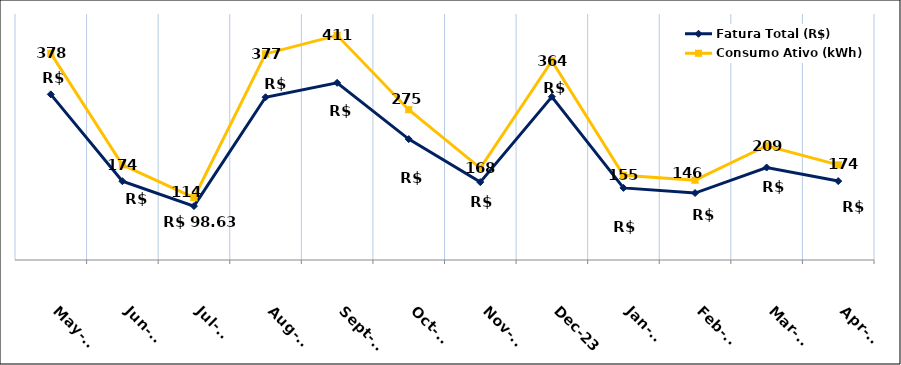
| Category | Fatura Total (R$) | Consumo Ativo (kWh) |
|---|---|---|
| 2023-05-01 | 302.95 | 378 |
| 2023-06-01 | 144.19 | 174 |
| 2023-07-01 | 98.63 | 114 |
| 2023-08-01 | 297.76 | 377 |
| 2023-09-01 | 324.06 | 411 |
| 2023-10-01 | 221.12 | 275 |
| 2023-11-01 | 142.44 | 168 |
| 2023-12-01 | 298.6 | 364 |
| 2024-01-01 | 131.93 | 155 |
| 2024-02-01 | 122.49 | 146 |
| 2024-03-01 | 169.19 | 209 |
| 2024-04-01 | 144.35 | 174 |